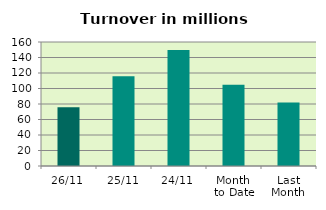
| Category | Series 0 |
|---|---|
| 26/11 | 75.95 |
| 25/11 | 115.896 |
| 24/11 | 149.746 |
| Month 
to Date | 104.843 |
| Last
Month | 81.795 |